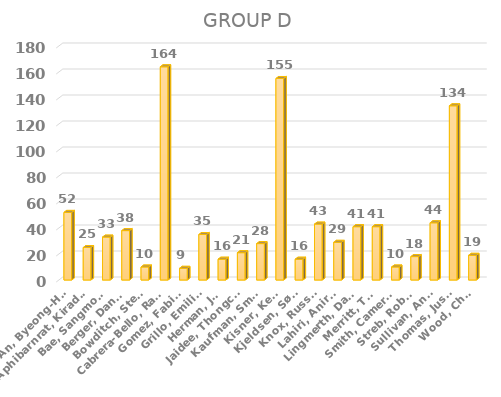
| Category | Series 0 |
|---|---|
| An, Byeong-Hun | 52 |
| Aphibarnrat, Kiradech | 25 |
| Bae, Sangmoon | 33 |
| Berger, Daniel | 38 |
| Bowditch, Steven | 10 |
| Cabrera-Bello, Rafael | 164 |
| Gomez, Fabian | 9 |
| Grillo, Emiliano | 35 |
| Herman, Jim | 16 |
| Jaidee, Thongchai | 21 |
| Kaufman, Smylie | 28 |
| Kisner, Kevin | 155 |
| Kjeldsen, Søren | 16 |
| Knox, Russell | 43 |
| Lahiri, Anirban | 29 |
| Lingmerth, David | 41 |
| Merritt, Troy | 41 |
| Smith, Cameron | 10 |
| Streb, Robert | 18 |
| Sullivan, Andy | 44 |
| Thomas, Justin | 134 |
| Wood, Chris | 19 |